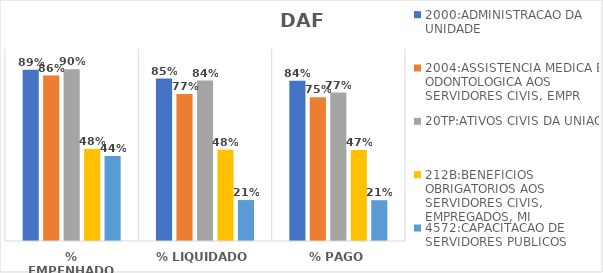
| Category | 2000:ADMINISTRACAO DA UNIDADE | 2004:ASSISTENCIA MEDICA E ODONTOLOGICA AOS SERVIDORES CIVIS, EMPR | 20TP:ATIVOS CIVIS DA UNIAO | 212B:BENEFICIOS OBRIGATORIOS AOS SERVIDORES CIVIS, EMPREGADOS, MI | 4572:CAPACITACAO DE SERVIDORES PUBLICOS FEDERAIS EM PROCESSO DE Q |
|---|---|---|---|---|---|
| % EMPENHADO | 0.891 | 0.862 | 0.895 | 0.479 | 0.443 |
| % LIQUIDADO | 0.846 | 0.765 | 0.835 | 0.475 | 0.213 |
| % PAGO | 0.835 | 0.749 | 0.773 | 0.474 | 0.213 |